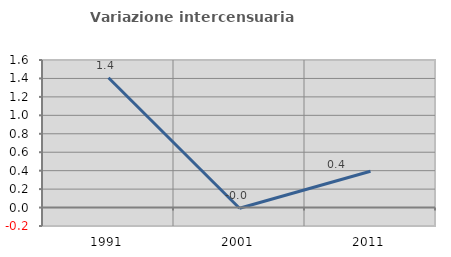
| Category | Variazione intercensuaria annua |
|---|---|
| 1991.0 | 1.407 |
| 2001.0 | -0.007 |
| 2011.0 | 0.394 |